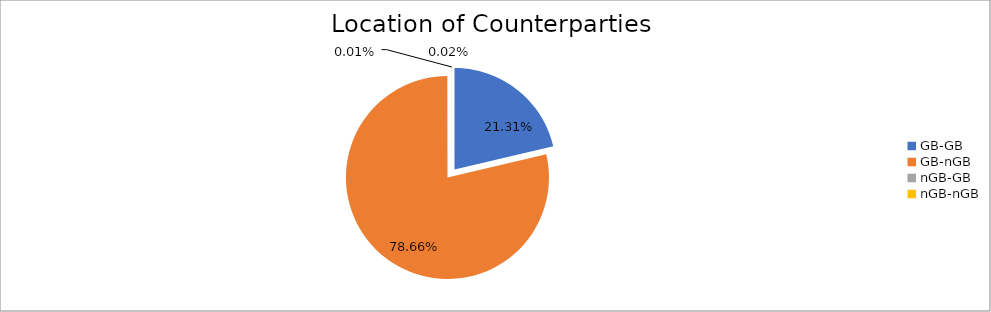
| Category | Series 0 |
|---|---|
| GB-GB | 1842286.169 |
| GB-nGB | 6798750.625 |
| nGB-GB | 697.225 |
| nGB-nGB | 1462.528 |